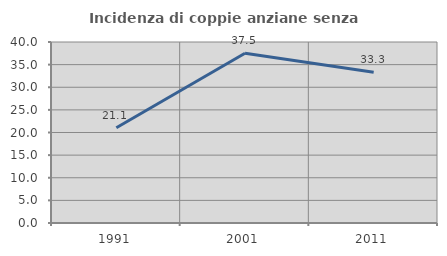
| Category | Incidenza di coppie anziane senza figli  |
|---|---|
| 1991.0 | 21.053 |
| 2001.0 | 37.5 |
| 2011.0 | 33.333 |